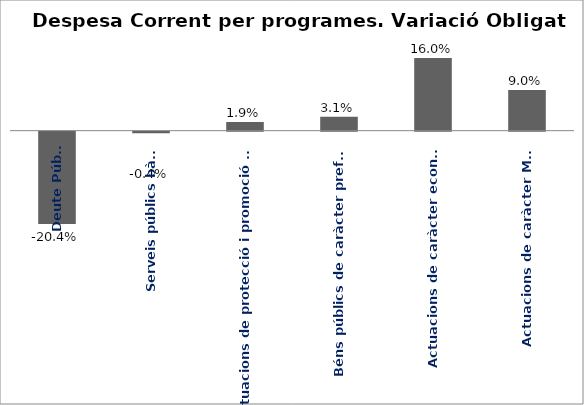
| Category | Series 0 |
|---|---|
| Deute Públic | -0.204 |
| Serveis públics bàsics | -0.004 |
| Actuacions de protecció i promoció social | 0.019 |
| Béns públics de caràcter preferent | 0.031 |
| Actuacions de caràcter econòmic | 0.16 |
| Actuacions de caràcter Marçal | 0.09 |